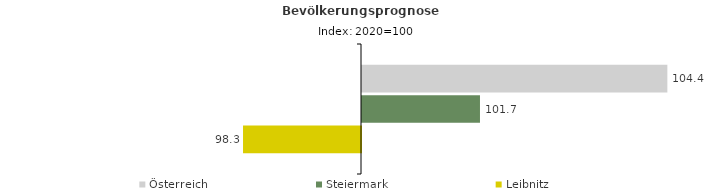
| Category | Österreich | Steiermark | Leibnitz |
|---|---|---|---|
| 2020.0 | 104.4 | 101.7 | 98.3 |